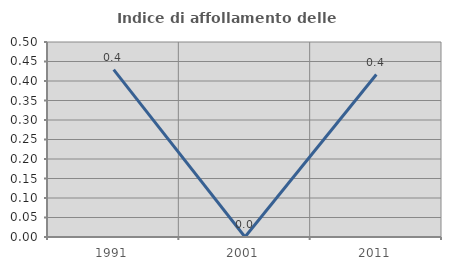
| Category | Indice di affollamento delle abitazioni  |
|---|---|
| 1991.0 | 0.429 |
| 2001.0 | 0 |
| 2011.0 | 0.417 |